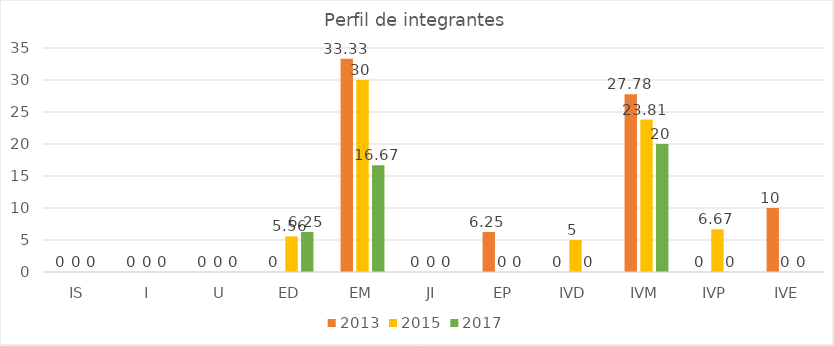
| Category | 2013 | 2015 | 2017 |
|---|---|---|---|
| IS | 0 | 0 | 0 |
| I | 0 | 0 | 0 |
| U | 0 | 0 | 0 |
| ED | 0 | 5.56 | 6.25 |
| EM | 33.33 | 30 | 16.67 |
| JI | 0 | 0 | 0 |
| EP | 6.25 | 0 | 0 |
| IVD | 0 | 5 | 0 |
| IVM | 27.78 | 23.81 | 20 |
| IVP | 0 | 6.67 | 0 |
| IVE | 10 | 0 | 0 |